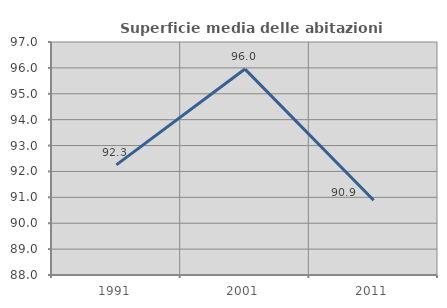
| Category | Superficie media delle abitazioni occupate |
|---|---|
| 1991.0 | 92.255 |
| 2001.0 | 95.954 |
| 2011.0 | 90.888 |